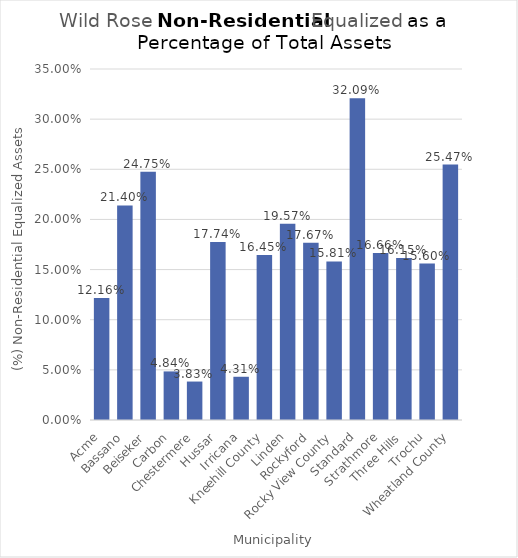
| Category | Non-Residential Equalized Assets |
|---|---|
| Acme | 0.122 |
| Bassano | 0.214 |
| Beiseker | 0.248 |
| Carbon | 0.048 |
| Chestermere | 0.038 |
| Hussar | 0.177 |
| Irricana | 0.043 |
| Kneehill County | 0.165 |
| Linden | 0.196 |
| Rockyford | 0.177 |
| Rocky View County | 0.158 |
| Standard | 0.321 |
| Strathmore | 0.167 |
| Three Hills | 0.161 |
| Trochu | 0.156 |
| Wheatland County | 0.255 |